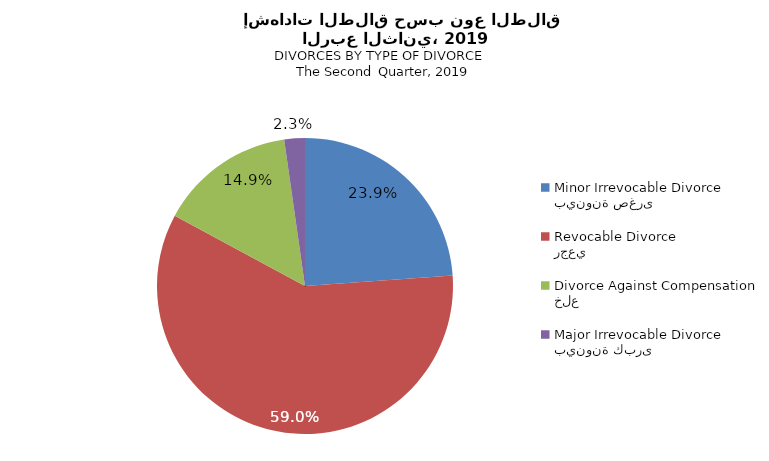
| Category | Series 1 |
|---|---|
| بينونة صغرى
Minor Irrevocable Divorce  | 23.874 |
| رجعي
Revocable Divorce  | 59.009 |
| خلع
Divorce Against Compensation | 14.865 |
| بينونة كبرى
Major Irrevocable Divorce  | 2.252 |